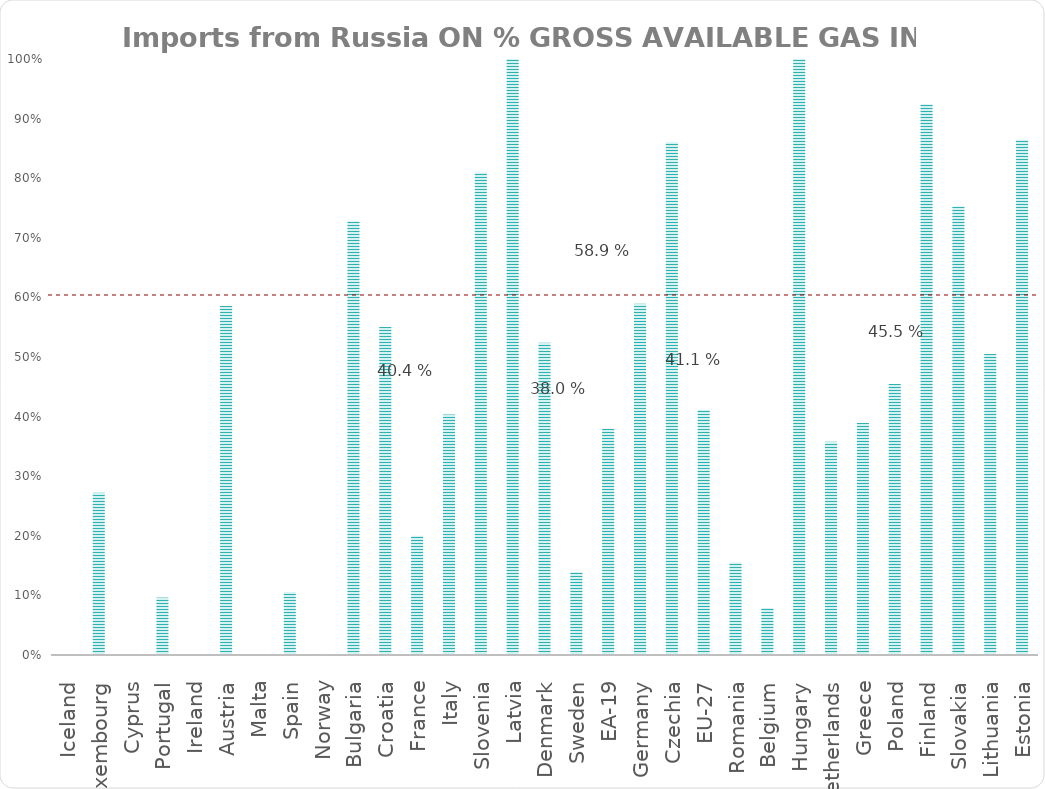
| Category | Natural gas |
|---|---|
| Iceland | 0 |
| Luxembourg | 0.272 |
| Cyprus | 0 |
| Portugal | 0.096 |
| Ireland | 0 |
| Austria | 0.586 |
| Malta | 0 |
| Spain | 0.105 |
| Norway | 0.002 |
| Bulgaria | 0.728 |
| Croatia | 0.55 |
| France | 0.2 |
| Italy | 0.404 |
| Slovenia | 0.81 |
| Latvia | 1.001 |
| Denmark | 0.524 |
| Sweden | 0.139 |
| EA-19 | 0.38 |
| Germany | 0.589 |
| Czechia | 0.86 |
| EU-27 | 0.411 |
| Romania | 0.155 |
| Belgium | 0.079 |
| Hungary | 1.104 |
| Netherlands | 0.358 |
| Greece | 0.389 |
| Poland | 0.455 |
| Finland | 0.924 |
| Slovakia | 0.752 |
| Lithuania | 0.505 |
| Estonia | 0.865 |